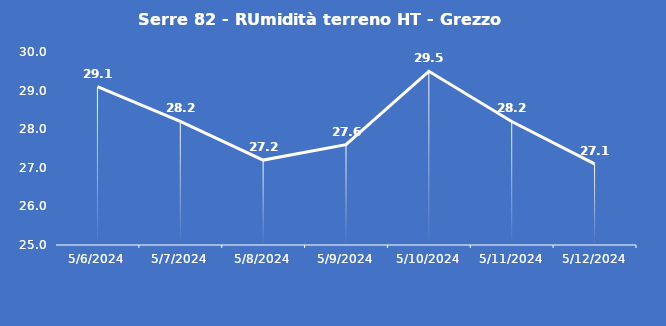
| Category | Serre 82 - RUmidità terreno HT - Grezzo (%VWC) |
|---|---|
| 5/6/24 | 29.1 |
| 5/7/24 | 28.2 |
| 5/8/24 | 27.2 |
| 5/9/24 | 27.6 |
| 5/10/24 | 29.5 |
| 5/11/24 | 28.2 |
| 5/12/24 | 27.1 |